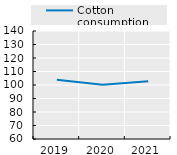
| Category | Cotton consumption |
|---|---|
| 2019.0 | 103.973 |
| 2020.0 | 100.13 |
| 2021.0 | 102.694 |